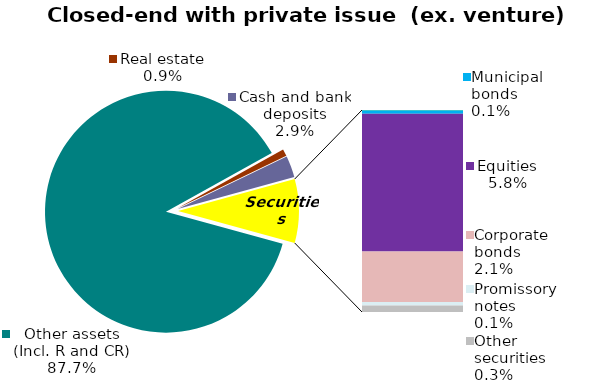
| Category | Series 0 |
|---|---|
| Other assets (Incl. R and CR) | 0.877 |
| Real estate | 0.009 |
| Cash and bank deposits | 0.029 |
| Bank metals | 0 |
| State bonds (OVDP) | 0 |
| Municipal bonds | 0.001 |
| Equities | 0.058 |
| Corporate bonds | 0.021 |
| Promissory notes | 0.001 |
| Other securities | 0.003 |